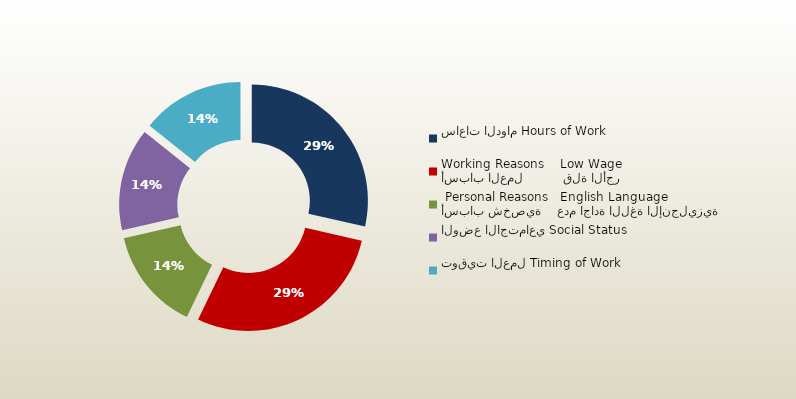
| Category | المجموع
Total |
|---|---|
| ساعات الدوام Hours of Work | 126 |
| أسباب العمل          قلة الأجر
Working Reasons    Low Wage | 126 |
| أسباب شخصية    عدم اجادة اللغة الإنجليزية
 Personal Reasons   English Language | 63 |
| الوضع الاجتماعي Social Status | 63 |
| توقيت العمل Timing of Work | 63 |